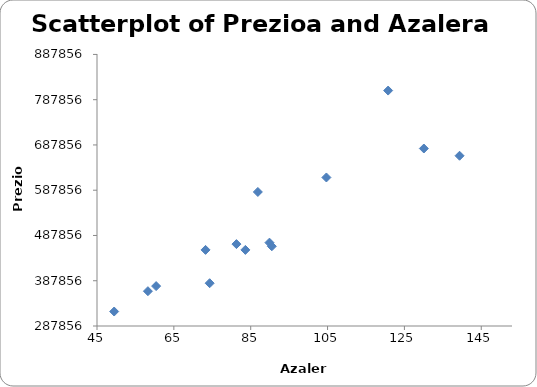
| Category | Series 0 |
|---|---|
| 49.47 | 319840 |
| 58.25 | 364800 |
| 60.39 | 376000 |
| 73.25 | 456000 |
| 74.32 | 382400 |
| 81.29 | 468800 |
| 83.61 | 456000 |
| 86.86 | 584000 |
| 89.88 | 472000 |
| 90.49 | 464000 |
| 104.7 | 616000 |
| 120.77 | 808000 |
| 130.06 | 680000 |
| 139.35 | 664000 |